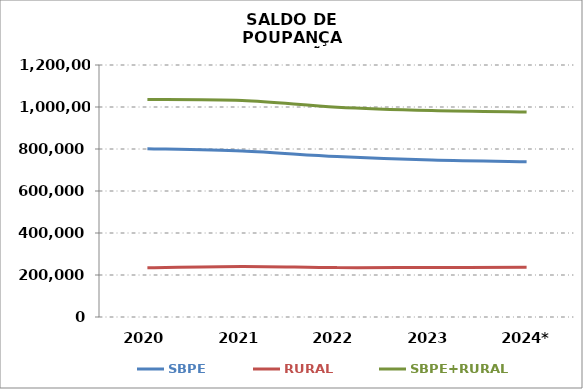
| Category | SBPE | RURAL | SBPE+RURAL |
|---|---|---|---|
| 2020 | 801437.985 | 234189.821 | 1035627.806 |
| 2021 | 790109.013 | 240493.997 | 1030603.01 |
| 2022 | 763815.066 | 235128.245 | 998943.311 |
| 2023 | 747081.247 | 235952.658 | 983033.905 |
| 2024* | 739421.538 | 236348.442 | 975769.98 |